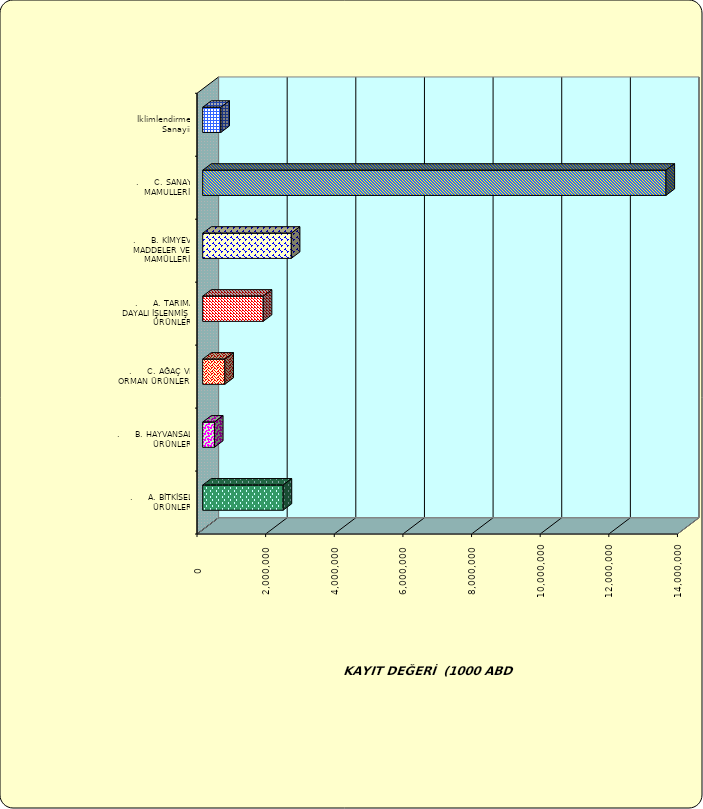
| Category | Series 0 |
|---|---|
| .     A. BİTKİSEL ÜRÜNLER | 2343430.944 |
| .     B. HAYVANSAL ÜRÜNLER | 342867.294 |
| .     C. AĞAÇ VE ORMAN ÜRÜNLERİ | 645760.579 |
| .     A. TARIMA DAYALI İŞLENMİŞ ÜRÜNLER | 1764068.934 |
| .     B. KİMYEVİ MADDELER VE MAMÜLLERİ | 2581961.65 |
| .     C. SANAYİ MAMULLERİ | 13499548.445 |
|  İklimlendirme Sanayii | 529079.502 |